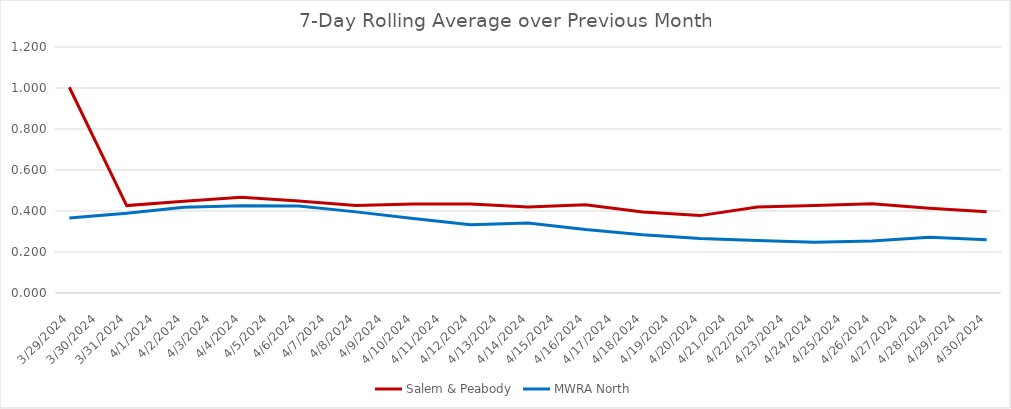
| Category | Salem & Peabody | MWRA North |
|---|---|---|
| 3/29/24 | 1.004 | 0.366 |
| 3/31/24 | 0.426 | 0.389 |
| 4/2/24 | 0.448 | 0.418 |
| 4/4/24 | 0.468 | 0.425 |
| 4/6/24 | 0.449 | 0.424 |
| 4/8/24 | 0.426 | 0.396 |
| 4/10/24 | 0.434 | 0.363 |
| 4/12/24 | 0.434 | 0.333 |
| 4/14/24 | 0.42 | 0.342 |
| 4/16/24 | 0.43 | 0.31 |
| 4/18/24 | 0.395 | 0.284 |
| 4/20/24 | 0.377 | 0.266 |
| 4/22/24 | 0.42 | 0.257 |
| 4/24/24 | 0.426 | 0.248 |
| 4/26/24 | 0.435 | 0.254 |
| 4/28/24 | 0.414 | 0.272 |
| 4/30/24 | 0.396 | 0.26 |